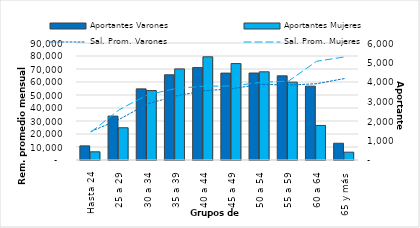
| Category | Aportantes Varones | Aportantes Mujeres |
|---|---|---|
| Hasta 24 | 724 | 421 |
| 25 a 29 | 2251 | 1654 |
| 30 a 34 | 3647 | 3562 |
| 35 a 39 | 4369 | 4672 |
| 40 a 44 | 4740 | 5292 |
| 45 a 49 | 4456 | 4945 |
| 50 a 54 | 4460 | 4523 |
| 55 a 59 | 4316 | 3993 |
| 60 a 64 | 3786 | 1772 |
| 65 y más | 859 | 401 |